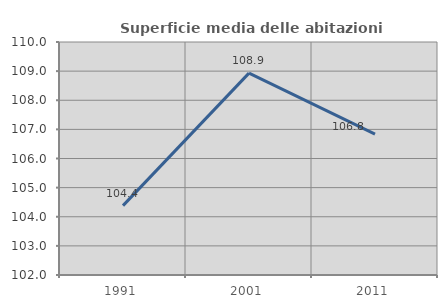
| Category | Superficie media delle abitazioni occupate |
|---|---|
| 1991.0 | 104.382 |
| 2001.0 | 108.932 |
| 2011.0 | 106.839 |